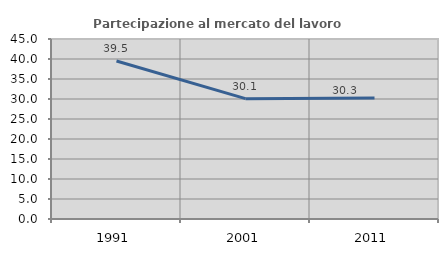
| Category | Partecipazione al mercato del lavoro  femminile |
|---|---|
| 1991.0 | 39.498 |
| 2001.0 | 30.092 |
| 2011.0 | 30.278 |